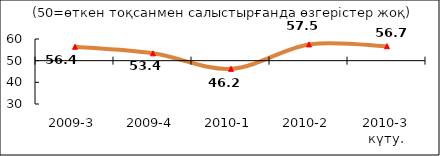
| Category | Диф.индекс ↓ |
|---|---|
| 2009-3 | 56.415 |
| 2009-4 | 53.385 |
| 2010-1 | 46.225 |
| 2010-2 | 57.5 |
| 2010-3 күту. | 56.67 |